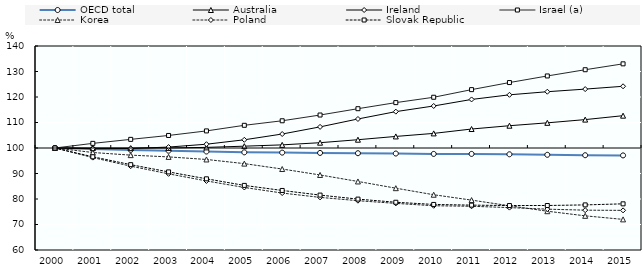
| Category | OECD total | Australia | Ireland | Israel (a) | Korea | Poland | Slovak Republic |
|---|---|---|---|---|---|---|---|
| 2000.0 | 100 | 100 | 100 | 100 | 100 | 100 | 100 |
| 2001.0 | 99.595 | 99.965 | 99.725 | 101.814 | 98.234 | 96.237 | 96.561 |
| 2002.0 | 99.255 | 99.956 | 99.813 | 103.387 | 97.201 | 92.878 | 93.467 |
| 2003.0 | 98.949 | 100.025 | 100.362 | 104.918 | 96.515 | 89.868 | 90.625 |
| 2004.0 | 98.631 | 100.245 | 101.485 | 106.701 | 95.504 | 87.081 | 87.915 |
| 2005.0 | 98.301 | 100.712 | 103.223 | 108.898 | 93.878 | 84.519 | 85.331 |
| 2006.0 | 98.189 | 101.228 | 105.484 | 110.678 | 91.754 | 82.332 | 83.348 |
| 2007.0 | 98.075 | 102.082 | 108.28 | 112.929 | 89.428 | 80.632 | 81.528 |
| 2008.0 | 97.959 | 103.252 | 111.379 | 115.414 | 86.876 | 79.334 | 79.954 |
| 2009.0 | 97.834 | 104.536 | 114.261 | 117.798 | 84.242 | 78.28 | 78.723 |
| 2010.0 | 97.682 | 105.729 | 116.478 | 119.899 | 81.668 | 77.35 | 77.863 |
| 2011.0 | 97.681 | 107.442 | 119.04 | 122.891 | 79.565 | 77.148 | 77.596 |
| 2012.0 | 97.535 | 108.742 | 120.855 | 125.664 | 77.344 | 76.626 | 77.433 |
| 2013.0 | 97.331 | 109.868 | 122.075 | 128.249 | 75.209 | 76.013 | 77.45 |
| 2014.0 | 97.171 | 111.135 | 123.095 | 130.693 | 73.397 | 75.619 | 77.686 |
| 2015.0 | 97.096 | 112.675 | 124.202 | 133.007 | 72.005 | 75.54 | 78.105 |